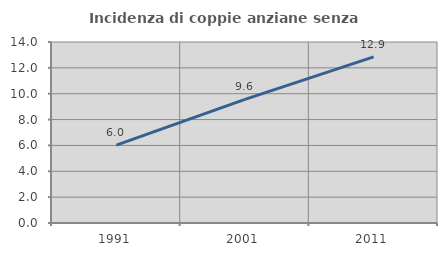
| Category | Incidenza di coppie anziane senza figli  |
|---|---|
| 1991.0 | 6.019 |
| 2001.0 | 9.564 |
| 2011.0 | 12.852 |